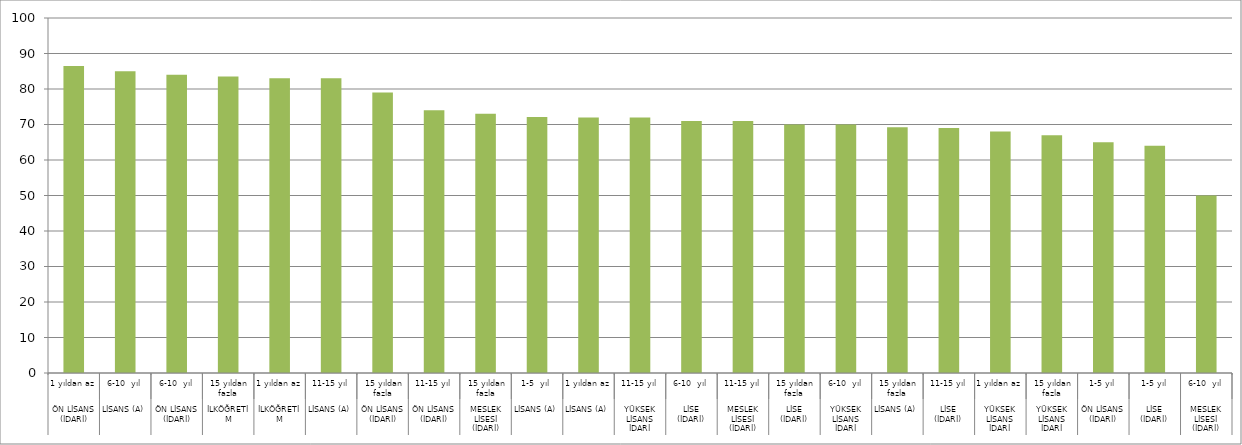
| Category | Series 0 |
|---|---|
| 0 | 86.5 |
| 1 | 85 |
| 2 | 84 |
| 3 | 83.5 |
| 4 | 83 |
| 5 | 83 |
| 6 | 79 |
| 7 | 74 |
| 8 | 73 |
| 9 | 72.1 |
| 10 | 72 |
| 11 | 72 |
| 12 | 71 |
| 13 | 71 |
| 14 | 70 |
| 15 | 70 |
| 16 | 69.2 |
| 17 | 69 |
| 18 | 68 |
| 19 | 67 |
| 20 | 65 |
| 21 | 64 |
| 22 | 50 |